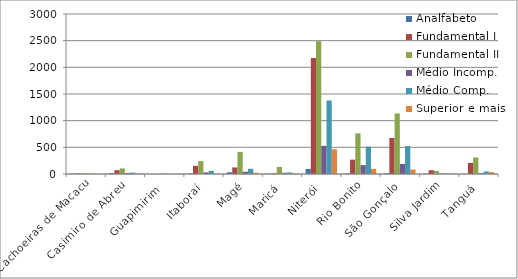
| Category | Analfabeto | Fundamental I | Fundamental II | Médio Incomp. | Médio Comp. | Superior e mais |
|---|---|---|---|---|---|---|
| Cachoeiras de Macacu | 2 | 10 | 14 | 2 | 3 | 0 |
| Casimiro de Abreu | 19 | 72 | 104 | 18 | 26 | 7 |
| Guapimirim  | 0 | 0 | 7 | 0 | 0 | 0 |
| Itaboraí | 10 | 152 | 241 | 31 | 59 | 6 |
| Magé | 33 | 123 | 415 | 42 | 97 | 24 |
| Maricá | 3 | 13 | 132 | 22 | 30 | 11 |
| Niterói | 95 | 2175 | 2490 | 528 | 1378 | 463 |
| Rio Bonito | 11 | 269 | 761 | 167 | 514 | 96 |
| São Gonçalo | 16 | 675 | 1135 | 189 | 523 | 84 |
| Silva Jardim | 7 | 72 | 57 | 6 | 11 | 3 |
| Tanguá | 3 | 208 | 310 | 17 | 47 | 36 |